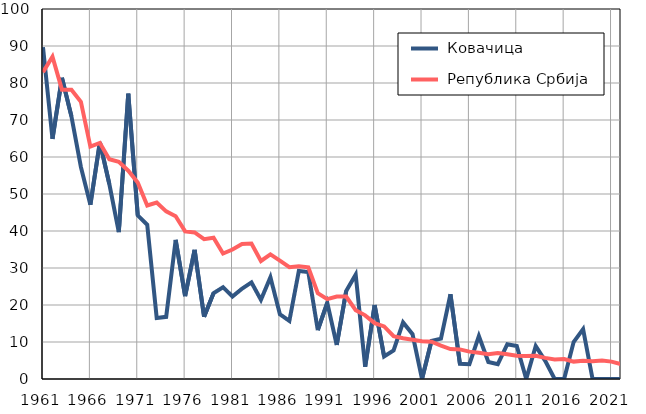
| Category |  Ковачица |  Република Србија |
|---|---|---|
| 1961.0 | 89.7 | 82.9 |
| 1962.0 | 64.9 | 87.1 |
| 1963.0 | 81.4 | 78.2 |
| 1964.0 | 71 | 78.2 |
| 1965.0 | 57.3 | 74.9 |
| 1966.0 | 47.1 | 62.8 |
| 1967.0 | 64 | 63.8 |
| 1968.0 | 52.7 | 59.4 |
| 1969.0 | 39.7 | 58.7 |
| 1970.0 | 77.1 | 56.3 |
| 1971.0 | 44.2 | 53.1 |
| 1972.0 | 41.7 | 46.9 |
| 1973.0 | 16.5 | 47.7 |
| 1974.0 | 16.8 | 45.3 |
| 1975.0 | 37.6 | 44 |
| 1976.0 | 22.4 | 39.9 |
| 1977.0 | 34.9 | 39.6 |
| 1978.0 | 16.8 | 37.8 |
| 1979.0 | 23.2 | 38.2 |
| 1980.0 | 24.8 | 33.9 |
| 1981.0 | 22.3 | 35 |
| 1982.0 | 24.4 | 36.5 |
| 1983.0 | 26.1 | 36.6 |
| 1984.0 | 21.4 | 31.9 |
| 1985.0 | 27.5 | 33.7 |
| 1986.0 | 17.5 | 32 |
| 1987.0 | 15.7 | 30.2 |
| 1988.0 | 29.2 | 30.5 |
| 1989.0 | 28.9 | 30.2 |
| 1990.0 | 13.2 | 23.2 |
| 1991.0 | 20.6 | 21.6 |
| 1992.0 | 9.2 | 22.3 |
| 1993.0 | 23.8 | 22.3 |
| 1994.0 | 28.2 | 18.6 |
| 1995.0 | 3.3 | 17.2 |
| 1996.0 | 20 | 15.1 |
| 1997.0 | 6.1 | 14.2 |
| 1998.0 | 7.7 | 11.6 |
| 1999.0 | 15.3 | 11 |
| 2000.0 | 12.1 | 10.6 |
| 2001.0 | 0 | 10.2 |
| 2002.0 | 10.3 | 10.1 |
| 2003.0 | 10.9 | 9 |
| 2004.0 | 22.9 | 8.1 |
| 2005.0 | 4.1 | 8 |
| 2006.0 | 4 | 7.4 |
| 2007.0 | 11.6 | 7.1 |
| 2008.0 | 4.6 | 6.7 |
| 2009.0 | 4 | 7 |
| 2010.0 | 9.4 | 6.7 |
| 2011.0 | 8.9 | 6.3 |
| 2012.0 | 0 | 6.2 |
| 2013.0 | 8.9 | 6.3 |
| 2014.0 | 4.9 | 5.7 |
| 2015.0 | 0 | 5.3 |
| 2016.0 | 0 | 5.4 |
| 2017.0 | 10 | 4.7 |
| 2018.0 | 13.5 | 4.9 |
| 2019.0 | 0 | 4.8 |
| 2020.0 | 0 | 5 |
| 2021.0 | 0 | 4.7 |
| 2022.0 | 0 | 4 |